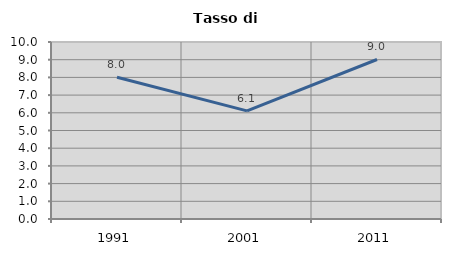
| Category | Tasso di disoccupazione   |
|---|---|
| 1991.0 | 8.01 |
| 2001.0 | 6.108 |
| 2011.0 | 9.012 |